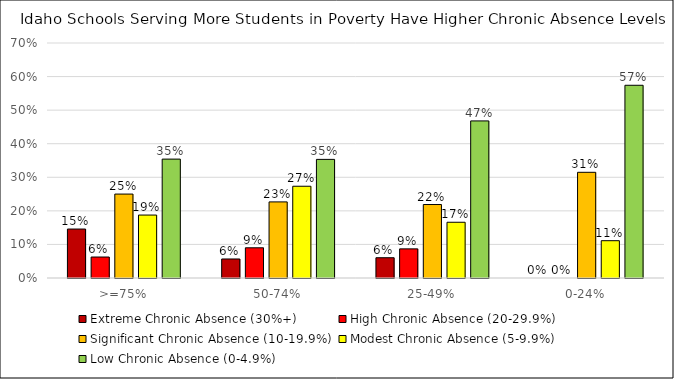
| Category | Extreme Chronic Absence (30%+) | High Chronic Absence (20-29.9%) | Significant Chronic Absence (10-19.9%) | Modest Chronic Absence (5-9.9%) | Low Chronic Absence (0-4.9%) |
|---|---|---|---|---|---|
| >=75% | 0.146 | 0.062 | 0.25 | 0.188 | 0.354 |
| 50-74% | 0.057 | 0.09 | 0.227 | 0.273 | 0.353 |
| 25-49% | 0.06 | 0.087 | 0.219 | 0.166 | 0.468 |
| 0-24% | 0 | 0 | 0.315 | 0.111 | 0.574 |